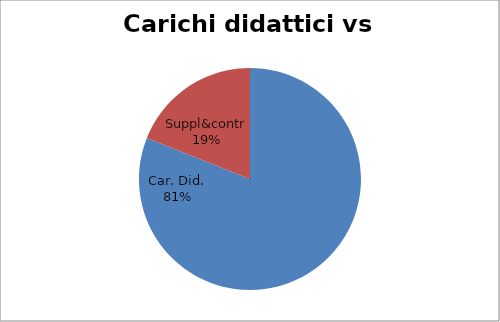
| Category | Series 0 |
|---|---|
| Car. Did. | 0.81 |
| Suppl&contr | 0.19 |